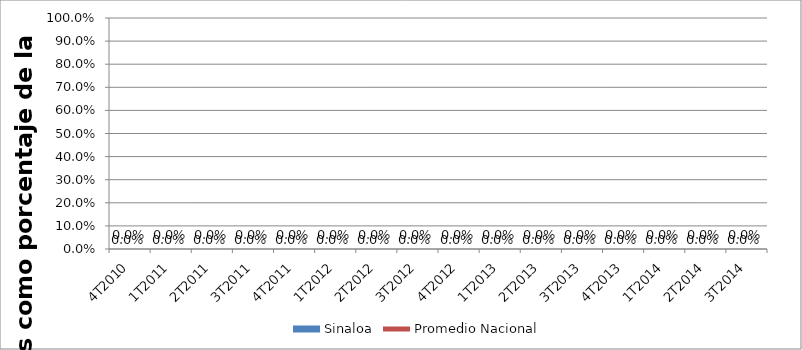
| Category | Sinaloa |
|---|---|
| 4T2010 | 0 |
| 1T2011 | 0 |
| 2T2011 | 0 |
| 3T2011 | 0 |
| 4T2011 | 0 |
| 1T2012 | 0 |
| 2T2012 | 0 |
| 3T2012 | 0 |
| 4T2012 | 0 |
| 1T2013 | 0 |
| 2T2013 | 0 |
| 3T2013 | 0 |
| 4T2013 | 0 |
| 1T2014 | 0 |
| 2T2014 | 0 |
| 3T2014 | 0 |